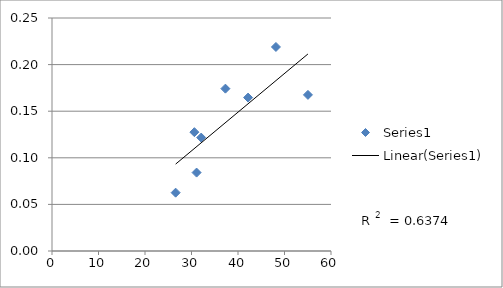
| Category | Series 0 |
|---|---|
| 37.288304841924344 | 0.174 |
| 31.092725658811275 | 0.084 |
| 42.1688577698831 | 0.165 |
| 48.15938306168594 | 0.219 |
| 32.08281674984786 | 0.122 |
| 55.03700745620046 | 0.168 |
| 30.619456563657874 | 0.128 |
| 26.589648385043382 | 0.063 |